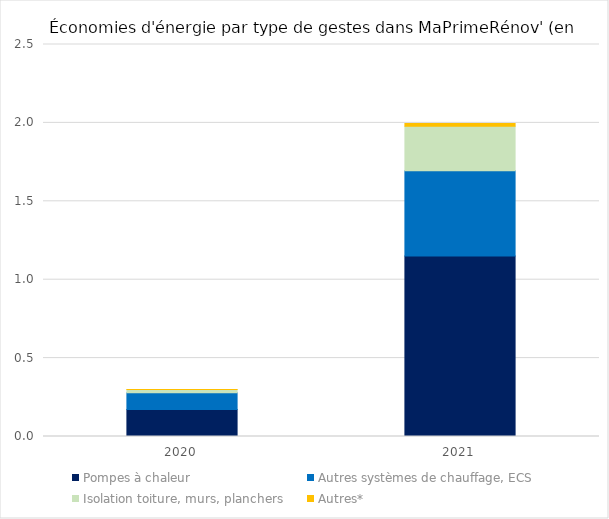
| Category | Pompes à chaleur | Autres systèmes de chauffage, ECS | Isolation toiture, murs, planchers | Autres* |
|---|---|---|---|---|
| 2020.0 | 0.172 | 0.106 | 0.021 | 0.001 |
| 2021.0 | 1.151 | 0.543 | 0.284 | 0.019 |